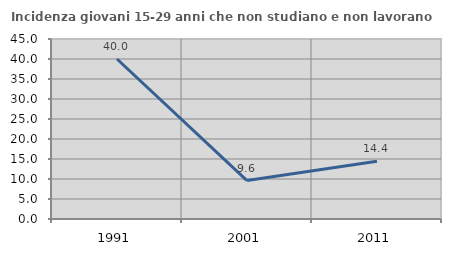
| Category | Incidenza giovani 15-29 anni che non studiano e non lavorano  |
|---|---|
| 1991.0 | 40 |
| 2001.0 | 9.615 |
| 2011.0 | 14.411 |